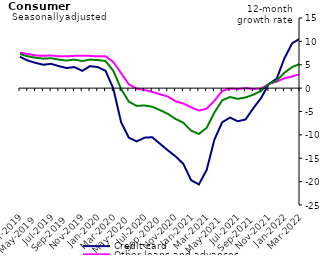
| Category | Credit card | Other loans and advances | Total |
|---|---|---|---|
| Mar-2019 | 6.7 | 7.6 | 7.3 |
| Apr-2019 | 5.9 | 7.3 | 6.8 |
| May-2019 | 5.4 | 7 | 6.5 |
| Jun-2019 | 5 | 6.9 | 6.3 |
| Jul-2019 | 5.2 | 7 | 6.4 |
| Aug-2019 | 4.7 | 6.8 | 6.1 |
| Sep-2019 | 4.3 | 6.8 | 5.9 |
| Oct-2019 | 4.5 | 6.9 | 6.1 |
| Nov-2019 | 3.7 | 6.9 | 5.8 |
| Dec-2019 | 4.7 | 6.9 | 6.1 |
| Jan-2020 | 4.5 | 6.8 | 6 |
| Feb-2020 | 3.7 | 6.8 | 5.8 |
| Mar-2020 | -0.1 | 5.6 | 3.7 |
| Apr-2020 | -7.3 | 3.2 | -0.2 |
| May-2020 | -10.6 | 0.8 | -2.9 |
| Jun-2020 | -11.4 | -0.1 | -3.8 |
| Jul-2020 | -10.6 | -0.4 | -3.7 |
| Aug-2020 | -10.5 | -0.8 | -4 |
| Sep-2020 | -11.9 | -1.3 | -4.7 |
| Oct-2020 | -13.3 | -1.8 | -5.5 |
| Nov-2020 | -14.6 | -2.8 | -6.6 |
| Dec-2020 | -16.2 | -3.3 | -7.4 |
| Jan-2021 | -19.7 | -4.1 | -9.1 |
| Feb-2021 | -20.6 | -4.8 | -9.8 |
| Mar-2021 | -17.5 | -4.4 | -8.5 |
| Apr-2021 | -11 | -2.7 | -5.2 |
| May-2021 | -7.3 | -0.6 | -2.6 |
| Jun-2021 | -6.3 | -0.1 | -1.9 |
| Jul-2021 | -7.1 | -0.2 | -2.3 |
| Aug-2021 | -6.7 | 0 | -2 |
| Sep-2021 | -4.3 | -0.2 | -1.4 |
| Oct-2021 | -2.1 | -0.1 | -0.6 |
| Nov-2021 | 0.9 | 0.9 | 0.9 |
| Dec-2021 | 2 | 1.4 | 1.6 |
| Jan-2022 | 6.4 | 2.1 | 3.3 |
| Feb-2022 | 9.6 | 2.5 | 4.5 |
| Mar-2022 | 10.6 | 3 | 5.2 |